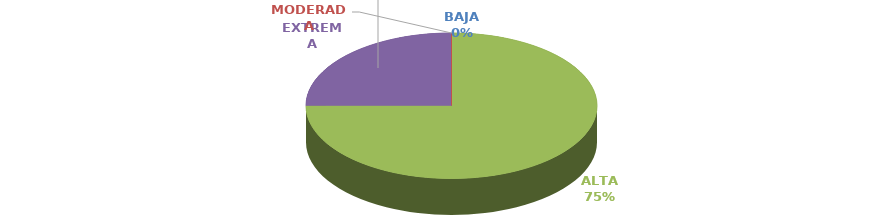
| Category | DISTRIBUCIÓN ZONA RIESGOS INHERENTES |
|---|---|
| BAJA | 0 |
| MODERADA | 0 |
| ALTA | 6 |
| EXTREMA | 2 |